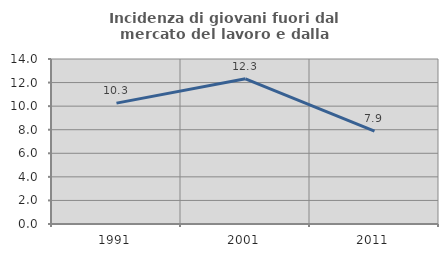
| Category | Incidenza di giovani fuori dal mercato del lavoro e dalla formazione  |
|---|---|
| 1991.0 | 10.256 |
| 2001.0 | 12.322 |
| 2011.0 | 7.879 |